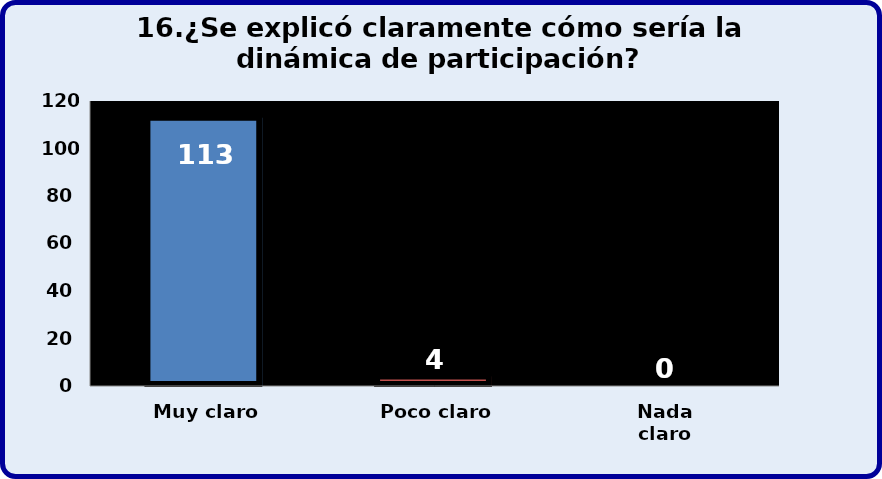
| Category | Series 0 |
|---|---|
| Muy claro | 113 |
| Poco claro | 4 |
| Nada claro | 0 |